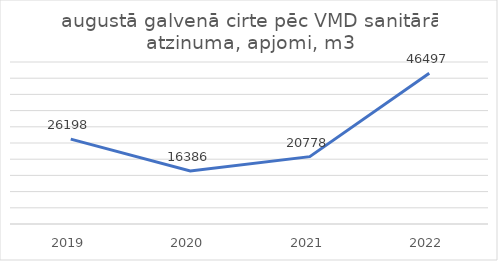
| Category | augustā galvenā cirte pēc VMD sanitārā atzinuma, apjomi, m3 |
|---|---|
| 2019.0 | 26198 |
| 2020.0 | 16386 |
| 2021.0 | 20778 |
| 2022.0 | 46497 |